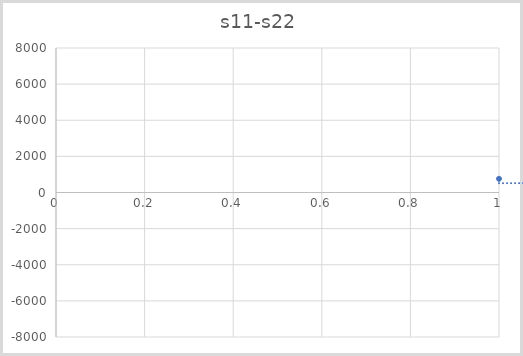
| Category | s11-s22 |
|---|---|
| 0 | 757 |
| 1 | -61 |
| 2 | 1803 |
| 3 | -1799 |
| 4 | 1306 |
| 5 | -5277 |
| 6 | 172 |
| 7 | 4741 |
| 8 | 1861 |
| 9 | 2866 |
| 10 | 3277 |
| 11 | -733 |
| 12 | 991 |
| 13 | 106 |
| 14 | -459 |
| 15 | 211 |
| 16 | 3557 |
| 17 | -290 |
| 18 | 3383 |
| 19 | 685 |
| 20 | 3230 |
| 21 | 715 |
| 22 | -730 |
| 23 | 2559 |
| 24 | 1903 |
| 25 | 2383 |
| 26 | -640 |
| 27 | 5 |
| 28 | 276 |
| 29 | -84 |
| 30 | -657 |
| 31 | -1708 |
| 32 | 2389 |
| 33 | 3321 |
| 34 | 127 |
| 35 | 1020 |
| 36 | 1176 |
| 37 | -1184 |
| 38 | 101 |
| 39 | 1065 |
| 40 | 1057 |
| 41 | 1926 |
| 42 | 1379 |
| 43 | -261 |
| 44 | 249 |
| 45 | 517 |
| 46 | 1257 |
| 47 | -536 |
| 48 | 887 |
| 49 | 5862 |
| 50 | 1594 |
| 51 | -4 |
| 52 | 3196 |
| 53 | -1340 |
| 54 | -1680 |
| 55 | -1822 |
| 56 | 2330 |
| 57 | -583 |
| 58 | 921 |
| 59 | 430 |
| 60 | 125 |
| 61 | 149 |
| 62 | 654 |
| 63 | -859 |
| 64 | -565 |
| 65 | 993 |
| 66 | 1204 |
| 67 | 2022 |
| 68 | 1327 |
| 69 | 2583 |
| 70 | -349 |
| 71 | -892 |
| 72 | 2150 |
| 73 | -2539 |
| 74 | 1728 |
| 75 | 5169 |
| 76 | 3386 |
| 77 | -1532 |
| 78 | 1210 |
| 79 | -1944 |
| 80 | -3385 |
| 81 | 1265 |
| 82 | -1175 |
| 83 | 151 |
| 84 | 670 |
| 85 | -1162 |
| 86 | -2126 |
| 87 | -4176 |
| 88 | 1014 |
| 89 | -2062 |
| 90 | -940 |
| 91 | 1121 |
| 92 | -2731 |
| 93 | -534 |
| 94 | 1307 |
| 95 | -1929 |
| 96 | 1417 |
| 97 | -647 |
| 98 | 3418 |
| 99 | -4374 |
| 100 | -1712 |
| 101 | -2904 |
| 102 | 3202 |
| 103 | 1807 |
| 104 | -380 |
| 105 | -2773 |
| 106 | -3510 |
| 107 | -776 |
| 108 | 1569 |
| 109 | -383 |
| 110 | 3769 |
| 111 | -1406 |
| 112 | -836 |
| 113 | 433 |
| 114 | 1942 |
| 115 | 538 |
| 116 | -1233 |
| 117 | -2122 |
| 118 | 609 |
| 119 | 1049 |
| 120 | 6392 |
| 121 | -1676 |
| 122 | 1643 |
| 123 | -2533 |
| 124 | -3838 |
| 125 | 1654 |
| 126 | 106 |
| 127 | 3001 |
| 128 | -150 |
| 129 | 3416 |
| 130 | 5378 |
| 131 | 1632 |
| 132 | -4977 |
| 133 | 899 |
| 134 | 2490 |
| 135 | -4035 |
| 136 | 572 |
| 137 | 494 |
| 138 | 3011 |
| 139 | 224 |
| 140 | 3026 |
| 141 | 3869 |
| 142 | 1250 |
| 143 | 592 |
| 144 | -957 |
| 145 | 1678 |
| 146 | -275 |
| 147 | 3262 |
| 148 | -194 |
| 149 | 3264 |
| 150 | -3699 |
| 151 | 3261 |
| 152 | 710 |
| 153 | -111 |
| 154 | -130 |
| 155 | 3358 |
| 156 | 4645 |
| 157 | -2242 |
| 158 | 348 |
| 159 | 1214 |
| 160 | -3166 |
| 161 | -3046 |
| 162 | -2078 |
| 163 | 3162 |
| 164 | -227 |
| 165 | -2154 |
| 166 | 242 |
| 167 | 2506 |
| 168 | -1965 |
| 169 | -925 |
| 170 | -179 |
| 171 | -159 |
| 172 | 1560 |
| 173 | -2710 |
| 174 | -1807 |
| 175 | 2264 |
| 176 | 1132 |
| 177 | 2874 |
| 178 | 1622 |
| 179 | 3052 |
| 180 | 1047 |
| 181 | 759 |
| 182 | -2418 |
| 183 | 522 |
| 184 | 1605 |
| 185 | 1370 |
| 186 | -51 |
| 187 | 480 |
| 188 | -2829 |
| 189 | 2384 |
| 190 | -840 |
| 191 | 3104 |
| 192 | -496 |
| 193 | 3061 |
| 194 | 2314 |
| 195 | 725 |
| 196 | 2439 |
| 197 | 4176 |
| 198 | 560 |
| 199 | -1626 |
| 200 | -2795 |
| 201 | 788 |
| 202 | -1234 |
| 203 | 3211 |
| 204 | 1109 |
| 205 | 1713 |
| 206 | 455 |
| 207 | -2032 |
| 208 | -40 |
| 209 | -734 |
| 210 | 2542 |
| 211 | 2587 |
| 212 | 2662 |
| 213 | 194 |
| 214 | -2400 |
| 215 | 1557 |
| 216 | 1910 |
| 217 | -631 |
| 218 | 2567 |
| 219 | -786 |
| 220 | 953 |
| 221 | 430 |
| 222 | -2362 |
| 223 | 659 |
| 224 | 1146 |
| 225 | -1572 |
| 226 | 622 |
| 227 | 1390 |
| 228 | 1923 |
| 229 | -256 |
| 230 | 2163 |
| 231 | 3800 |
| 232 | 919 |
| 233 | 20 |
| 234 | 89 |
| 235 | 1687 |
| 236 | 739 |
| 237 | 1436 |
| 238 | -748 |
| 239 | -2350 |
| 240 | 3319 |
| 241 | -1517 |
| 242 | 2188 |
| 243 | -612 |
| 244 | -1069 |
| 245 | -1015 |
| 246 | 3508 |
| 247 | -4250 |
| 248 | -968 |
| 249 | 528 |
| 250 | -187 |
| 251 | -743 |
| 252 | 2200 |
| 253 | 1943 |
| 254 | -2392 |
| 255 | -109 |
| 256 | 2325 |
| 257 | -314 |
| 258 | 1284 |
| 259 | -1199 |
| 260 | 1734 |
| 261 | 39 |
| 262 | 2278 |
| 263 | 323 |
| 264 | 408 |
| 265 | 155 |
| 266 | -2602 |
| 267 | 2454 |
| 268 | 1061 |
| 269 | 3395 |
| 270 | -2540 |
| 271 | 488 |
| 272 | 2710 |
| 273 | -15 |
| 274 | -2798 |
| 275 | 50 |
| 276 | 980 |
| 277 | -761 |
| 278 | 2504 |
| 279 | 2419 |
| 280 | -3372 |
| 281 | 1589 |
| 282 | -975 |
| 283 | 1615 |
| 284 | -532 |
| 285 | -843 |
| 286 | 2594 |
| 287 | 258 |
| 288 | 3751 |
| 289 | -270 |
| 290 | 2351 |
| 291 | -1609 |
| 292 | 1843 |
| 293 | 4067 |
| 294 | -1229 |
| 295 | -53 |
| 296 | 286 |
| 297 | -1819 |
| 298 | 136 |
| 299 | 1155 |
| 300 | 337 |
| 301 | 2591 |
| 302 | -1625 |
| 303 | 4829 |
| 304 | 1537 |
| 305 | 3623 |
| 306 | -103 |
| 307 | 1793 |
| 308 | 3233 |
| 309 | 3697 |
| 310 | -1820 |
| 311 | -3380 |
| 312 | -5807 |
| 313 | -4521 |
| 314 | 1915 |
| 315 | 2940 |
| 316 | -5313 |
| 317 | 5740 |
| 318 | 1464 |
| 319 | 3739 |
| 320 | 2143 |
| 321 | -4318 |
| 322 | 522 |
| 323 | 2209 |
| 324 | -205 |
| 325 | 2454 |
| 326 | 930 |
| 327 | -119 |
| 328 | -1786 |
| 329 | 413 |
| 330 | -3341 |
| 331 | -1379 |
| 332 | -854 |
| 333 | 2297 |
| 334 | -1097 |
| 335 | -2475 |
| 336 | -915 |
| 337 | 3528 |
| 338 | 1378 |
| 339 | -305 |
| 340 | -962 |
| 341 | -1005 |
| 342 | 2934 |
| 343 | -4266 |
| 344 | 1109 |
| 345 | 6542 |
| 346 | 3750 |
| 347 | -531 |
| 348 | -844 |
| 349 | 258 |
| 350 | 2612 |